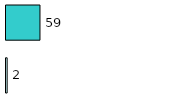
| Category | Series 0 | Series 1 |
|---|---|---|
| 0 | 2 | 59 |